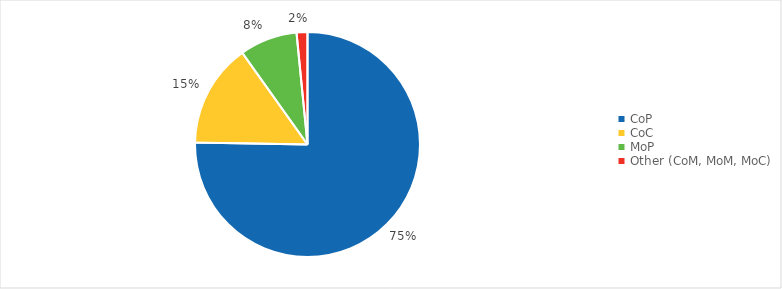
| Category | Series 0 |
|---|---|
| CoP | 0.753 |
| CoC | 0.149 |
| MoP | 0.083 |
| Other (CoM, MoM, MoC) | 0.016 |